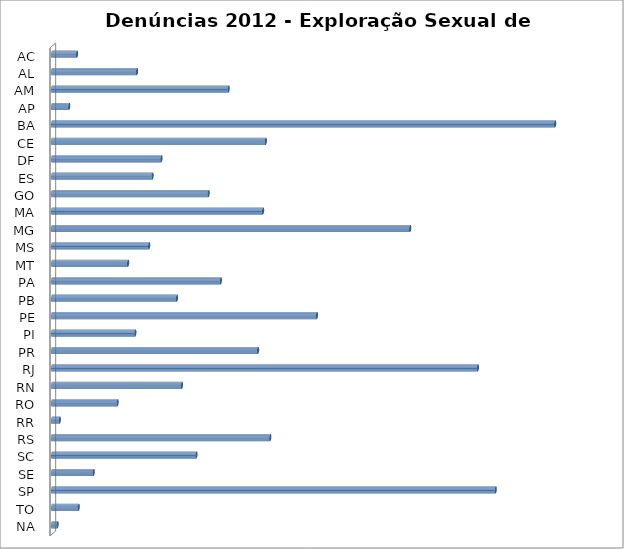
| Category | Series 0 |
|---|---|
| AC | 45 |
| AL | 153 |
| AM | 318 |
| AP | 31 |
| BA | 906 |
| CE | 385 |
| DF | 197 |
| ES | 181 |
| GO | 282 |
| MA | 380 |
| MG | 645 |
| MS | 175 |
| MT | 137 |
| PA | 304 |
| PB | 225 |
| PE | 477 |
| PI | 150 |
| PR | 371 |
| RJ | 767 |
| RN | 234 |
| RO | 118 |
| RR | 14 |
| RS | 393 |
| SC | 260 |
| SE | 75 |
| SP | 799 |
| TO | 48 |
| NA | 10 |